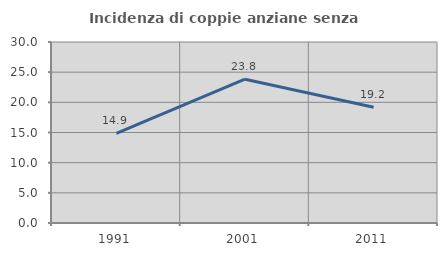
| Category | Incidenza di coppie anziane senza figli  |
|---|---|
| 1991.0 | 14.872 |
| 2001.0 | 23.834 |
| 2011.0 | 19.186 |